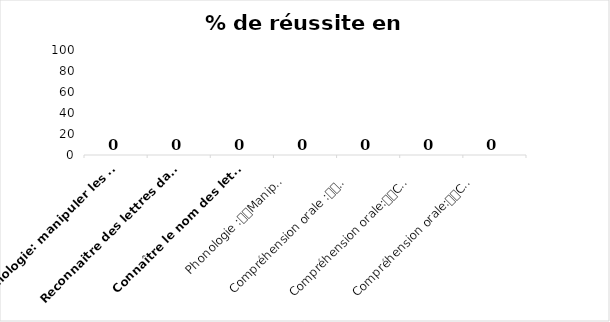
| Category | Series 0 |
|---|---|
| Phonologie: manipuler les syllabes | 0 |
| Reconnaitre des lettres dans une suite de lettres ( discrimination visuelle) | 0 |
| Connaître le nom des lettres  | 0 |
| Phonologie :
Manipuler les phonèmes | 0 |
| Compréhension orale :
Comprendre des phrases lues par l'adulte | 0 |
| Compréhension orale:
Comprendre des mots donnés par l'adulte | 0 |
| Compréhension orale:
Comprendre un texte lu par l'adulte | 0 |